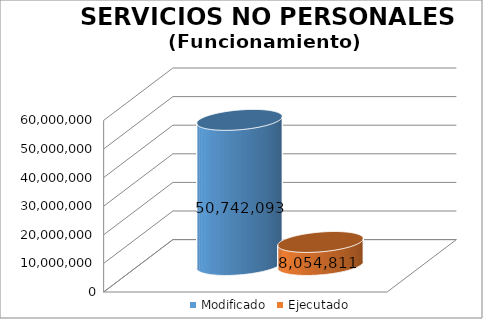
| Category | Modificado | Ejecutado |
|---|---|---|
| 0 | 50742093 | 8054810.55 |